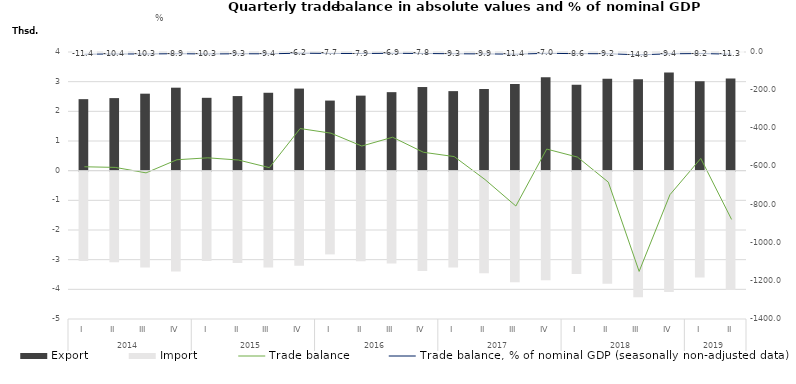
| Category | Export | Import |
|---|---|---|
| 0 | 2410.6 | -3012.4 |
| 1 | 2445.8 | -3050.9 |
| 2 | 2595.1 | -3228.9 |
| 3 | 2797.1 | -3362.1 |
| 4 | 2455.7 | -3010.6 |
| 5 | 2514.6 | -3081.1 |
| 6 | 2626 | -3232.3 |
| 7 | 2766.9 | -3168.2 |
| 8 | 2362.6 | -2788.3 |
| 9 | 2529.5 | -3022.6 |
| 10 | 2646.4 | -3093.3 |
| 11 | 2819.2 | -3345 |
| 12 | 2681.2 | -3229.7 |
| 13 | 2753.3 | -3422.2 |
| 14 | 2922.9 | -3730.5 |
| 15 | 3149.7 | -3658.7 |
| 16 | 2895.5 | -3446.6 |
| 17 | 3097.3 | -3779.7 |
| 18 | 3082.2 | -4232.7 |
| 19 | 3310.7 | -4058.8 |
| 20 | 3012.8 | -3570.9 |
| 21 | 3107.7 | -3985.7 |